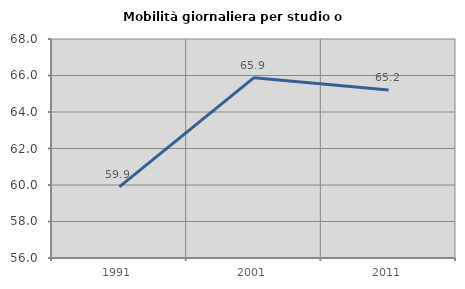
| Category | Mobilità giornaliera per studio o lavoro |
|---|---|
| 1991.0 | 59.9 |
| 2001.0 | 65.879 |
| 2011.0 | 65.211 |